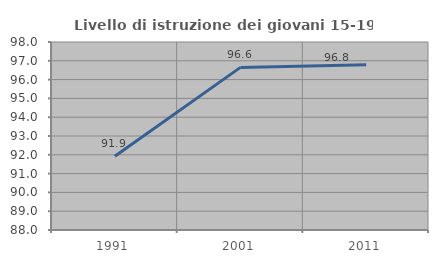
| Category | Livello di istruzione dei giovani 15-19 anni |
|---|---|
| 1991.0 | 91.919 |
| 2001.0 | 96.65 |
| 2011.0 | 96.785 |